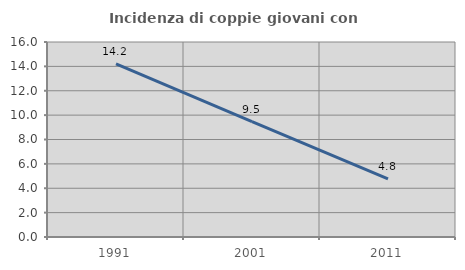
| Category | Incidenza di coppie giovani con figli |
|---|---|
| 1991.0 | 14.201 |
| 2001.0 | 9.471 |
| 2011.0 | 4.776 |